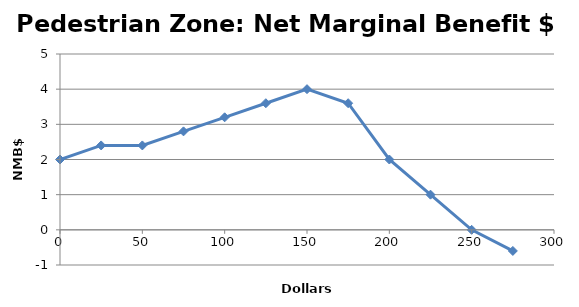
| Category | Pedestrian Zone |
|---|---|
| 0.0 | 2 |
| 25.0 | 2.4 |
| 50.0 | 2.4 |
| 75.0 | 2.8 |
| 100.0 | 3.2 |
| 125.0 | 3.6 |
| 150.0 | 4 |
| 175.0 | 3.6 |
| 200.0 | 2 |
| 225.0 | 1 |
| 250.0 | 0 |
| 275.0 | -0.6 |